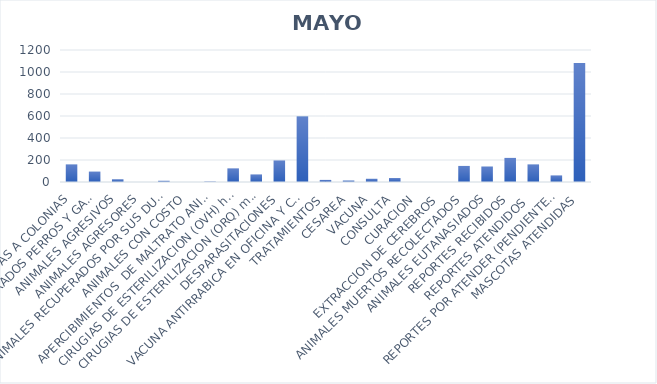
| Category | Series 0 |
|---|---|
| VISITAS A COLONIAS | 159 |
| ANIMALES CAPTURADOS PERROS Y GATOS  | 94 |
| ANIMALES AGRESIVOS | 25 |
| ANIMALES AGRESORES | 0 |
| ANIMALES RECUPERADOS POR SUS DUEÑOS | 11 |
| ANIMALES CON COSTO | 0 |
| APERCIBIMIENTOS  DE MALTRATO ANIMAL | 5 |
| CIRUGIAS DE ESTERILIZACION (OVH) hembra | 124 |
| CIRUGIAS DE ESTERILIZACION (ORQ) macho | 69 |
| DESPARASITACIONES | 196 |
| VACUNA ANTIRRABICA EN OFICINA Y CAMPAÑAS  | 595 |
| TRATAMIENTOS | 19 |
| CESAREA | 13 |
| VACUNA | 29 |
| CONSULTA | 36 |
| CURACION | 0 |
| EXTRACCION DE CEREBROS | 0 |
| ANIMALES MUERTOS RECOLECTADOS | 146 |
| ANIMALES EUTANASIADOS | 140 |
| REPORTES RECIBIDOS | 219 |
| REPORTES ATENDIDOS  | 159 |
| REPORTES POR ATENDER (PENDIENTES) | 60 |
| MASCOTAS ATENDIDAS | 1081 |